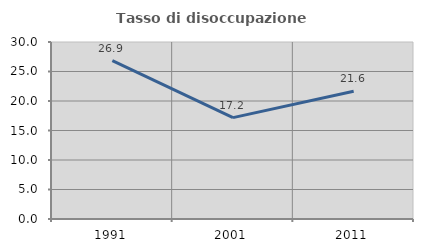
| Category | Tasso di disoccupazione giovanile  |
|---|---|
| 1991.0 | 26.852 |
| 2001.0 | 17.188 |
| 2011.0 | 21.649 |